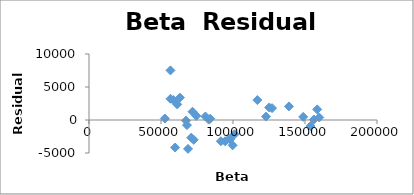
| Category | Series 0 |
|---|---|
| 59809.8 | -4167.048 |
| 68769.3 | -4374.234 |
| 70999.0 | -2679.175 |
| 72702.1 | -3003.884 |
| 68025.9 | -771.306 |
| 63147.4 | 3384.062 |
| 56543.6 | 7514.465 |
| 58627.5 | 3009.569 |
| 56589.8 | 3216.001 |
| 52678.7 | 229.225 |
| 61275.0 | 2354.949 |
| 74517.4 | 619.072 |
| 67338.6 | -95.047 |
| 71881.3 | 1254.936 |
| 84175.6 | 194.974 |
| 80859.3 | 537.352 |
| 83132.9 | 63.12 |
| 97323.7 | -2851.778 |
| 98067.2 | -2918.85 |
| 99746.4 | -3842.813 |
| 94553.2 | -3220.046 |
| 91574.3 | -3213.289 |
| 101097.6 | -2161.585 |
| 122921.6 | 511.381 |
| 116905.6 | 3016.719 |
| 125131.9 | 1902.559 |
| 127134.9 | 1794.254 |
| 148723.6 | 473.343 |
| 138859.4 | 2058.031 |
| 156176.2 | 75.332 |
| 153837.1 | -902.205 |
| 158444.1 | 1608.399 |
| 159879.9 | 383.516 |